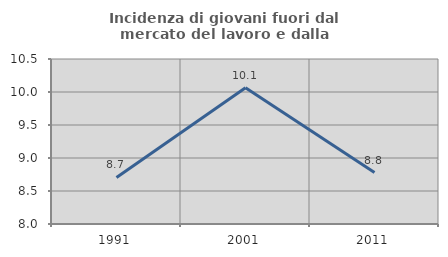
| Category | Incidenza di giovani fuori dal mercato del lavoro e dalla formazione  |
|---|---|
| 1991.0 | 8.706 |
| 2001.0 | 10.065 |
| 2011.0 | 8.779 |